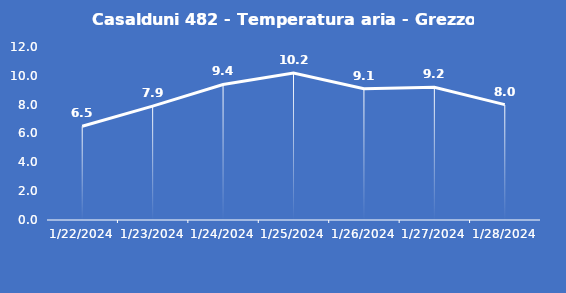
| Category | Casalduni 482 - Temperatura aria - Grezzo (°C) |
|---|---|
| 1/22/24 | 6.5 |
| 1/23/24 | 7.9 |
| 1/24/24 | 9.4 |
| 1/25/24 | 10.2 |
| 1/26/24 | 9.1 |
| 1/27/24 | 9.2 |
| 1/28/24 | 8 |